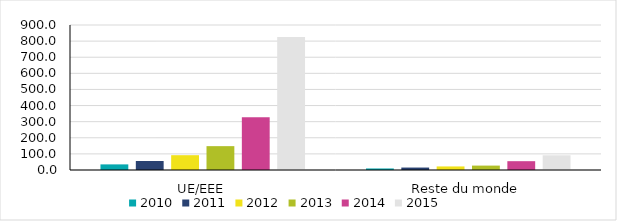
| Category | 2010 | 2011 | 2012 | 2013 | 2014 | 2015 |
|---|---|---|---|---|---|---|
| UE/EEE | 34.839 | 55.762 | 91.878 | 148.087 | 326.775 | 826.153 |
| Reste du monde | 9.567 | 15.2 | 22.111 | 27.331 | 54.737 | 91.299 |